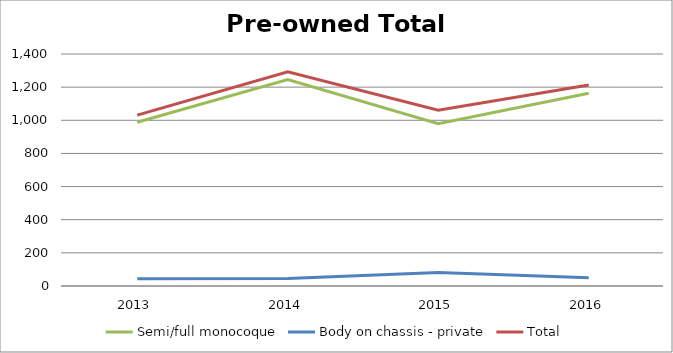
| Category | Semi/full monocoque | Body on chassis - private | Total |
|---|---|---|---|
| 2013.0 | 988 | 43 | 1031 |
| 2014.0 | 1246 | 46 | 1292 |
| 2015.0 | 979 | 82 | 1061 |
| 2016.0 | 1163 | 50 | 1213 |